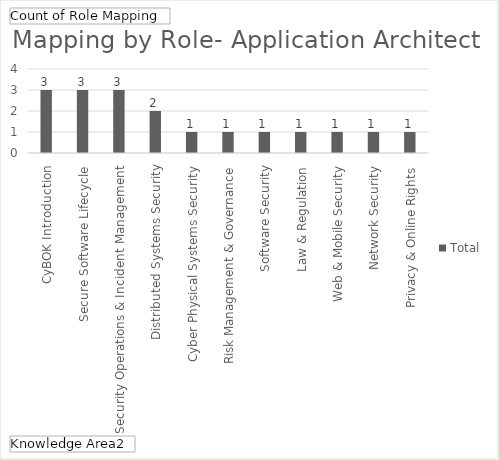
| Category | Total |
|---|---|
| CyBOK Introduction | 3 |
| Secure Software Lifecycle | 3 |
| Security Operations & Incident Management | 3 |
| Distributed Systems Security | 2 |
| Cyber Physical Systems Security | 1 |
| Risk Management & Governance | 1 |
| Software Security | 1 |
| Law & Regulation | 1 |
| Web & Mobile Security | 1 |
| Network Security | 1 |
| Privacy & Online Rights | 1 |